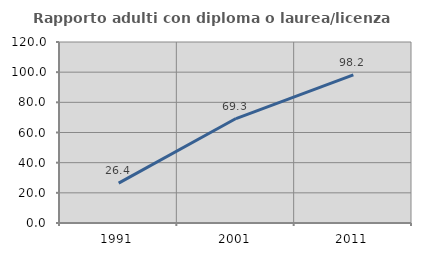
| Category | Rapporto adulti con diploma o laurea/licenza media  |
|---|---|
| 1991.0 | 26.415 |
| 2001.0 | 69.257 |
| 2011.0 | 98.168 |